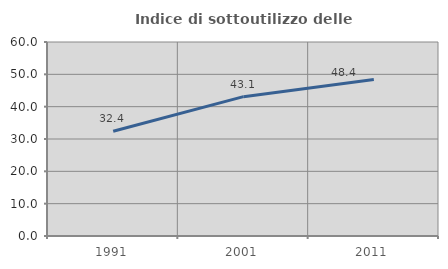
| Category | Indice di sottoutilizzo delle abitazioni  |
|---|---|
| 1991.0 | 32.374 |
| 2001.0 | 43.096 |
| 2011.0 | 48.408 |